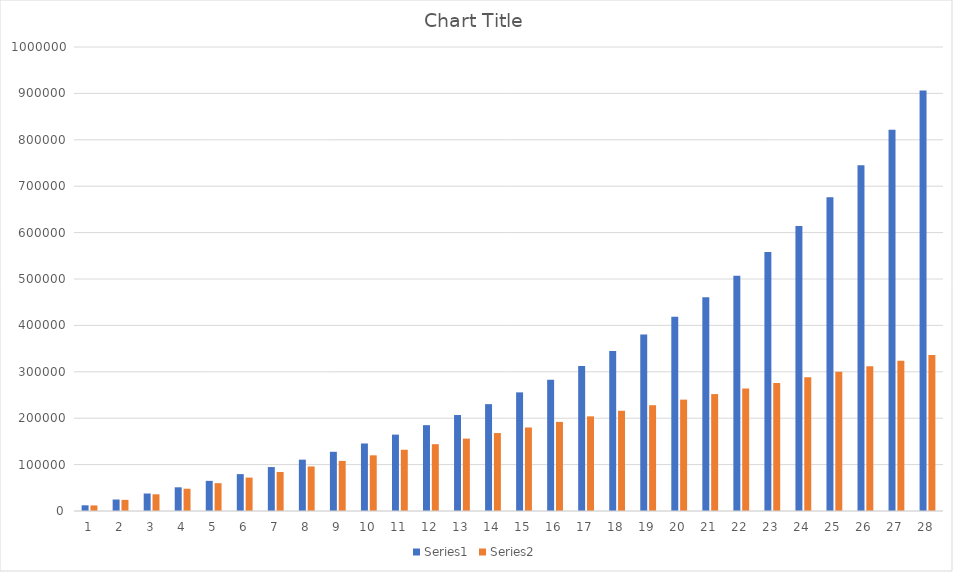
| Category | Series 0 | Series 1 |
|---|---|---|
| 0 | 12240 | 12000 |
| 1 | 24785 | 24000 |
| 2 | 37705 | 36000 |
| 3 | 51072 | 48000 |
| 4 | 64964 | 60000 |
| 5 | 79465 | 72000 |
| 6 | 94666 | 84000 |
| 7 | 110666 | 96000 |
| 8 | 127573 | 108000 |
| 9 | 145505 | 120000 |
| 10 | 164593 | 132000 |
| 11 | 184981 | 144000 |
| 12 | 206830 | 156000 |
| 13 | 230319 | 168000 |
| 14 | 255647 | 180000 |
| 15 | 283037 | 192000 |
| 16 | 312739 | 204000 |
| 17 | 345035 | 216000 |
| 18 | 380242 | 228000 |
| 19 | 418718 | 240000 |
| 20 | 460868 | 252000 |
| 21 | 507151 | 264000 |
| 22 | 558087 | 276000 |
| 23 | 614269 | 288000 |
| 24 | 676371 | 300000 |
| 25 | 745162 | 312000 |
| 26 | 821521 | 324000 |
| 27 | 906454 | 336000 |